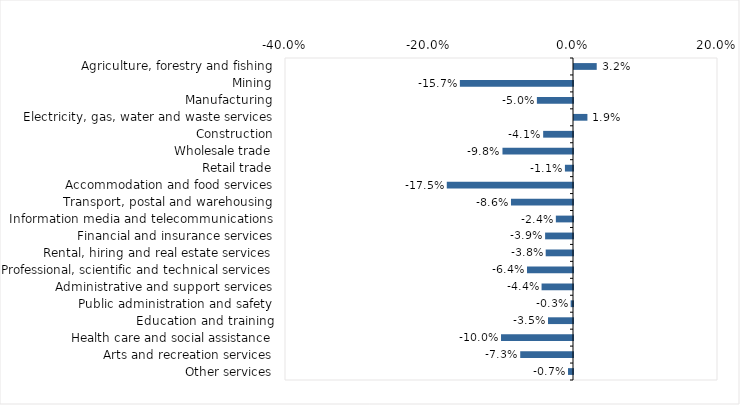
| Category | This week |
|---|---|
| Agriculture, forestry and fishing | 0.032 |
| Mining | -0.157 |
| Manufacturing | -0.05 |
| Electricity, gas, water and waste services | 0.019 |
| Construction | -0.041 |
| Wholesale trade | -0.098 |
| Retail trade | -0.011 |
| Accommodation and food services | -0.175 |
| Transport, postal and warehousing | -0.086 |
| Information media and telecommunications | -0.024 |
| Financial and insurance services | -0.039 |
| Rental, hiring and real estate services | -0.038 |
| Professional, scientific and technical services | -0.064 |
| Administrative and support services | -0.044 |
| Public administration and safety | -0.003 |
| Education and training | -0.035 |
| Health care and social assistance | -0.1 |
| Arts and recreation services | -0.073 |
| Other services | -0.007 |